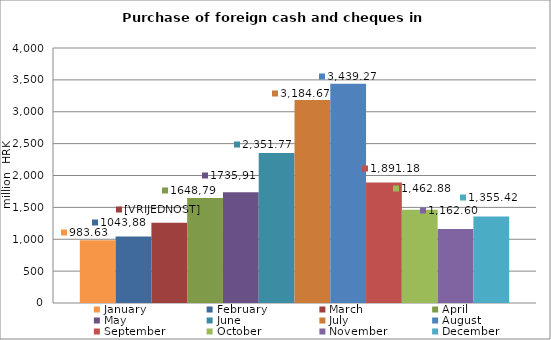
| Category | January | February | March | April | May | June | July | August | September | October | November | December |
|---|---|---|---|---|---|---|---|---|---|---|---|---|
| 0 | 983.632 | 1043.876 | 1258.009 | 1648.794 | 1735.914 | 2351.769 | 3184.671 | 3439.273 | 1891.178 | 1462.885 | 1162.6 | 1355.423 |